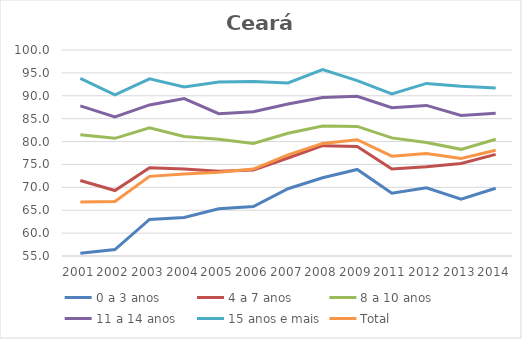
| Category | 0 a 3 anos | 4 a 7 anos | 8 a 10 anos | 11 a 14 anos | 15 anos e mais | Total |
|---|---|---|---|---|---|---|
| 2001.0 | 55.6 | 71.5 | 81.5 | 87.8 | 93.8 | 66.8 |
| 2002.0 | 56.4 | 69.3 | 80.7 | 85.4 | 90.2 | 66.9 |
| 2003.0 | 63 | 74.3 | 83 | 88 | 93.7 | 72.4 |
| 2004.0 | 63.4 | 74 | 81.1 | 89.4 | 91.9 | 72.9 |
| 2005.0 | 65.3 | 73.5 | 80.5 | 86.1 | 93 | 73.3 |
| 2006.0 | 65.8 | 73.8 | 79.6 | 86.5 | 93.1 | 74 |
| 2007.0 | 69.7 | 76.4 | 81.8 | 88.2 | 92.8 | 77.1 |
| 2008.0 | 72.1 | 79.1 | 83.4 | 89.6 | 95.7 | 79.6 |
| 2009.0 | 73.9 | 78.9 | 83.3 | 89.9 | 93.3 | 80.4 |
| 2011.0 | 68.7 | 74 | 80.8 | 87.4 | 90.4 | 76.8 |
| 2012.0 | 69.9 | 74.5 | 79.8 | 87.9 | 92.7 | 77.4 |
| 2013.0 | 67.4 | 75.2 | 78.3 | 85.7 | 92.1 | 76.3 |
| 2014.0 | 69.8 | 77.2 | 80.5 | 86.2 | 91.7 | 78.1 |